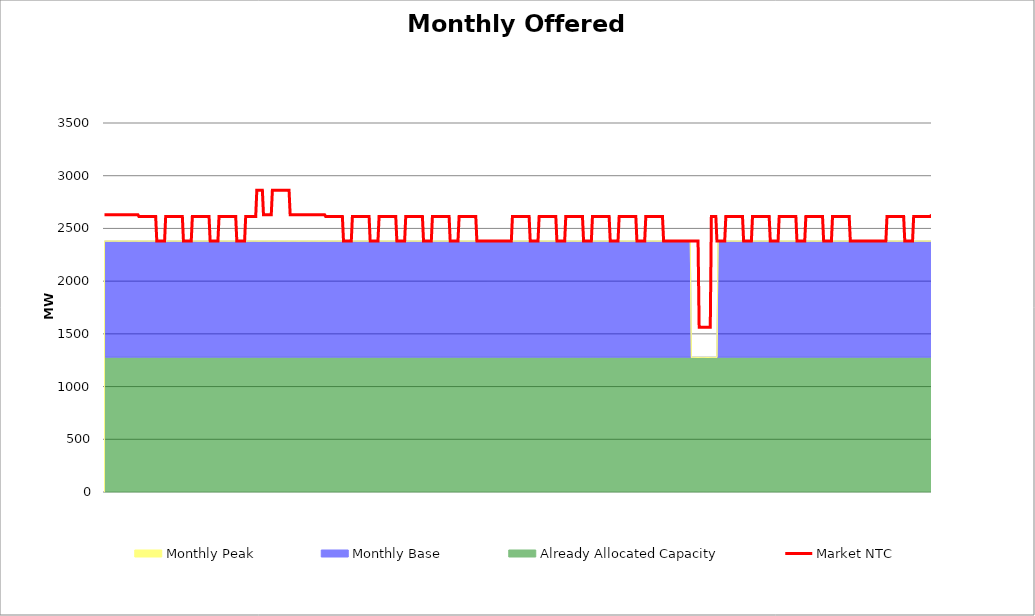
| Category | Market NTC |
|---|---|
| 0 | 2630 |
| 1 | 2630 |
| 2 | 2630 |
| 3 | 2630 |
| 4 | 2630 |
| 5 | 2630 |
| 6 | 2630 |
| 7 | 2630 |
| 8 | 2630 |
| 9 | 2630 |
| 10 | 2630 |
| 11 | 2630 |
| 12 | 2630 |
| 13 | 2630 |
| 14 | 2630 |
| 15 | 2630 |
| 16 | 2630 |
| 17 | 2630 |
| 18 | 2630 |
| 19 | 2630 |
| 20 | 2630 |
| 21 | 2630 |
| 22 | 2630 |
| 23 | 2630 |
| 24 | 2630 |
| 25 | 2630 |
| 26 | 2630 |
| 27 | 2630 |
| 28 | 2630 |
| 29 | 2630 |
| 30 | 2630 |
| 31 | 2612 |
| 32 | 2612 |
| 33 | 2612 |
| 34 | 2612 |
| 35 | 2612 |
| 36 | 2612 |
| 37 | 2612 |
| 38 | 2612 |
| 39 | 2612 |
| 40 | 2612 |
| 41 | 2612 |
| 42 | 2612 |
| 43 | 2612 |
| 44 | 2612 |
| 45 | 2612 |
| 46 | 2612 |
| 47 | 2380 |
| 48 | 2380 |
| 49 | 2380 |
| 50 | 2380 |
| 51 | 2380 |
| 52 | 2380 |
| 53 | 2380 |
| 54 | 2380 |
| 55 | 2612 |
| 56 | 2612 |
| 57 | 2612 |
| 58 | 2612 |
| 59 | 2612 |
| 60 | 2612 |
| 61 | 2612 |
| 62 | 2612 |
| 63 | 2612 |
| 64 | 2612 |
| 65 | 2612 |
| 66 | 2612 |
| 67 | 2612 |
| 68 | 2612 |
| 69 | 2612 |
| 70 | 2612 |
| 71 | 2380 |
| 72 | 2380 |
| 73 | 2380 |
| 74 | 2380 |
| 75 | 2380 |
| 76 | 2380 |
| 77 | 2380 |
| 78 | 2380 |
| 79 | 2612 |
| 80 | 2612 |
| 81 | 2612 |
| 82 | 2612 |
| 83 | 2612 |
| 84 | 2612 |
| 85 | 2612 |
| 86 | 2612 |
| 87 | 2612 |
| 88 | 2612 |
| 89 | 2612 |
| 90 | 2612 |
| 91 | 2612 |
| 92 | 2612 |
| 93 | 2612 |
| 94 | 2612 |
| 95 | 2380 |
| 96 | 2380 |
| 97 | 2380 |
| 98 | 2380 |
| 99 | 2380 |
| 100 | 2380 |
| 101 | 2380 |
| 102 | 2380 |
| 103 | 2612 |
| 104 | 2612 |
| 105 | 2612 |
| 106 | 2612 |
| 107 | 2612 |
| 108 | 2612 |
| 109 | 2612 |
| 110 | 2612 |
| 111 | 2612 |
| 112 | 2612 |
| 113 | 2612 |
| 114 | 2612 |
| 115 | 2612 |
| 116 | 2612 |
| 117 | 2612 |
| 118 | 2612 |
| 119 | 2380 |
| 120 | 2380 |
| 121 | 2380 |
| 122 | 2380 |
| 123 | 2380 |
| 124 | 2380 |
| 125 | 2380 |
| 126 | 2380 |
| 127 | 2612 |
| 128 | 2612 |
| 129 | 2612 |
| 130 | 2612 |
| 131 | 2612 |
| 132 | 2612 |
| 133 | 2612 |
| 134 | 2612 |
| 135 | 2612 |
| 136 | 2612 |
| 137 | 2862 |
| 138 | 2862 |
| 139 | 2862 |
| 140 | 2862 |
| 141 | 2862 |
| 142 | 2862 |
| 143 | 2630 |
| 144 | 2630 |
| 145 | 2630 |
| 146 | 2630 |
| 147 | 2630 |
| 148 | 2630 |
| 149 | 2630 |
| 150 | 2630 |
| 151 | 2862 |
| 152 | 2862 |
| 153 | 2862 |
| 154 | 2862 |
| 155 | 2862 |
| 156 | 2862 |
| 157 | 2862 |
| 158 | 2862 |
| 159 | 2862 |
| 160 | 2862 |
| 161 | 2862 |
| 162 | 2862 |
| 163 | 2862 |
| 164 | 2862 |
| 165 | 2862 |
| 166 | 2862 |
| 167 | 2630 |
| 168 | 2630 |
| 169 | 2630 |
| 170 | 2630 |
| 171 | 2630 |
| 172 | 2630 |
| 173 | 2630 |
| 174 | 2630 |
| 175 | 2630 |
| 176 | 2630 |
| 177 | 2630 |
| 178 | 2630 |
| 179 | 2630 |
| 180 | 2630 |
| 181 | 2630 |
| 182 | 2630 |
| 183 | 2630 |
| 184 | 2630 |
| 185 | 2630 |
| 186 | 2630 |
| 187 | 2630 |
| 188 | 2630 |
| 189 | 2630 |
| 190 | 2630 |
| 191 | 2630 |
| 192 | 2630 |
| 193 | 2630 |
| 194 | 2630 |
| 195 | 2630 |
| 196 | 2630 |
| 197 | 2630 |
| 198 | 2630 |
| 199 | 2612 |
| 200 | 2612 |
| 201 | 2612 |
| 202 | 2612 |
| 203 | 2612 |
| 204 | 2612 |
| 205 | 2612 |
| 206 | 2612 |
| 207 | 2612 |
| 208 | 2612 |
| 209 | 2612 |
| 210 | 2612 |
| 211 | 2612 |
| 212 | 2612 |
| 213 | 2612 |
| 214 | 2612 |
| 215 | 2380 |
| 216 | 2380 |
| 217 | 2380 |
| 218 | 2380 |
| 219 | 2380 |
| 220 | 2380 |
| 221 | 2380 |
| 222 | 2380 |
| 223 | 2612 |
| 224 | 2612 |
| 225 | 2612 |
| 226 | 2612 |
| 227 | 2612 |
| 228 | 2612 |
| 229 | 2612 |
| 230 | 2612 |
| 231 | 2612 |
| 232 | 2612 |
| 233 | 2612 |
| 234 | 2612 |
| 235 | 2612 |
| 236 | 2612 |
| 237 | 2612 |
| 238 | 2612 |
| 239 | 2380 |
| 240 | 2380 |
| 241 | 2380 |
| 242 | 2380 |
| 243 | 2380 |
| 244 | 2380 |
| 245 | 2380 |
| 246 | 2380 |
| 247 | 2612 |
| 248 | 2612 |
| 249 | 2612 |
| 250 | 2612 |
| 251 | 2612 |
| 252 | 2612 |
| 253 | 2612 |
| 254 | 2612 |
| 255 | 2612 |
| 256 | 2612 |
| 257 | 2612 |
| 258 | 2612 |
| 259 | 2612 |
| 260 | 2612 |
| 261 | 2612 |
| 262 | 2612 |
| 263 | 2380 |
| 264 | 2380 |
| 265 | 2380 |
| 266 | 2380 |
| 267 | 2380 |
| 268 | 2380 |
| 269 | 2380 |
| 270 | 2380 |
| 271 | 2612 |
| 272 | 2612 |
| 273 | 2612 |
| 274 | 2612 |
| 275 | 2612 |
| 276 | 2612 |
| 277 | 2612 |
| 278 | 2612 |
| 279 | 2612 |
| 280 | 2612 |
| 281 | 2612 |
| 282 | 2612 |
| 283 | 2612 |
| 284 | 2612 |
| 285 | 2612 |
| 286 | 2612 |
| 287 | 2380 |
| 288 | 2380 |
| 289 | 2380 |
| 290 | 2380 |
| 291 | 2380 |
| 292 | 2380 |
| 293 | 2380 |
| 294 | 2380 |
| 295 | 2612 |
| 296 | 2612 |
| 297 | 2612 |
| 298 | 2612 |
| 299 | 2612 |
| 300 | 2612 |
| 301 | 2612 |
| 302 | 2612 |
| 303 | 2612 |
| 304 | 2612 |
| 305 | 2612 |
| 306 | 2612 |
| 307 | 2612 |
| 308 | 2612 |
| 309 | 2612 |
| 310 | 2612 |
| 311 | 2380 |
| 312 | 2380 |
| 313 | 2380 |
| 314 | 2380 |
| 315 | 2380 |
| 316 | 2380 |
| 317 | 2380 |
| 318 | 2380 |
| 319 | 2612 |
| 320 | 2612 |
| 321 | 2612 |
| 322 | 2612 |
| 323 | 2612 |
| 324 | 2612 |
| 325 | 2612 |
| 326 | 2612 |
| 327 | 2612 |
| 328 | 2612 |
| 329 | 2612 |
| 330 | 2612 |
| 331 | 2612 |
| 332 | 2612 |
| 333 | 2612 |
| 334 | 2612 |
| 335 | 2380 |
| 336 | 2380 |
| 337 | 2380 |
| 338 | 2380 |
| 339 | 2380 |
| 340 | 2380 |
| 341 | 2380 |
| 342 | 2380 |
| 343 | 2380 |
| 344 | 2380 |
| 345 | 2380 |
| 346 | 2380 |
| 347 | 2380 |
| 348 | 2380 |
| 349 | 2380 |
| 350 | 2380 |
| 351 | 2380 |
| 352 | 2380 |
| 353 | 2380 |
| 354 | 2380 |
| 355 | 2380 |
| 356 | 2380 |
| 357 | 2380 |
| 358 | 2380 |
| 359 | 2380 |
| 360 | 2380 |
| 361 | 2380 |
| 362 | 2380 |
| 363 | 2380 |
| 364 | 2380 |
| 365 | 2380 |
| 366 | 2380 |
| 367 | 2612 |
| 368 | 2612 |
| 369 | 2612 |
| 370 | 2612 |
| 371 | 2612 |
| 372 | 2612 |
| 373 | 2612 |
| 374 | 2612 |
| 375 | 2612 |
| 376 | 2612 |
| 377 | 2612 |
| 378 | 2612 |
| 379 | 2612 |
| 380 | 2612 |
| 381 | 2612 |
| 382 | 2612 |
| 383 | 2380 |
| 384 | 2380 |
| 385 | 2380 |
| 386 | 2380 |
| 387 | 2380 |
| 388 | 2380 |
| 389 | 2380 |
| 390 | 2380 |
| 391 | 2612 |
| 392 | 2612 |
| 393 | 2612 |
| 394 | 2612 |
| 395 | 2612 |
| 396 | 2612 |
| 397 | 2612 |
| 398 | 2612 |
| 399 | 2612 |
| 400 | 2612 |
| 401 | 2612 |
| 402 | 2612 |
| 403 | 2612 |
| 404 | 2612 |
| 405 | 2612 |
| 406 | 2612 |
| 407 | 2380 |
| 408 | 2380 |
| 409 | 2380 |
| 410 | 2380 |
| 411 | 2380 |
| 412 | 2380 |
| 413 | 2380 |
| 414 | 2380 |
| 415 | 2612 |
| 416 | 2612 |
| 417 | 2612 |
| 418 | 2612 |
| 419 | 2612 |
| 420 | 2612 |
| 421 | 2612 |
| 422 | 2612 |
| 423 | 2612 |
| 424 | 2612 |
| 425 | 2612 |
| 426 | 2612 |
| 427 | 2612 |
| 428 | 2612 |
| 429 | 2612 |
| 430 | 2612 |
| 431 | 2380 |
| 432 | 2380 |
| 433 | 2380 |
| 434 | 2380 |
| 435 | 2380 |
| 436 | 2380 |
| 437 | 2380 |
| 438 | 2380 |
| 439 | 2612 |
| 440 | 2612 |
| 441 | 2612 |
| 442 | 2612 |
| 443 | 2612 |
| 444 | 2612 |
| 445 | 2612 |
| 446 | 2612 |
| 447 | 2612 |
| 448 | 2612 |
| 449 | 2612 |
| 450 | 2612 |
| 451 | 2612 |
| 452 | 2612 |
| 453 | 2612 |
| 454 | 2612 |
| 455 | 2380 |
| 456 | 2380 |
| 457 | 2380 |
| 458 | 2380 |
| 459 | 2380 |
| 460 | 2380 |
| 461 | 2380 |
| 462 | 2380 |
| 463 | 2612 |
| 464 | 2612 |
| 465 | 2612 |
| 466 | 2612 |
| 467 | 2612 |
| 468 | 2612 |
| 469 | 2612 |
| 470 | 2612 |
| 471 | 2612 |
| 472 | 2612 |
| 473 | 2612 |
| 474 | 2612 |
| 475 | 2612 |
| 476 | 2612 |
| 477 | 2612 |
| 478 | 2612 |
| 479 | 2380 |
| 480 | 2380 |
| 481 | 2380 |
| 482 | 2380 |
| 483 | 2380 |
| 484 | 2380 |
| 485 | 2380 |
| 486 | 2380 |
| 487 | 2612 |
| 488 | 2612 |
| 489 | 2612 |
| 490 | 2612 |
| 491 | 2612 |
| 492 | 2612 |
| 493 | 2612 |
| 494 | 2612 |
| 495 | 2612 |
| 496 | 2612 |
| 497 | 2612 |
| 498 | 2612 |
| 499 | 2612 |
| 500 | 2612 |
| 501 | 2612 |
| 502 | 2612 |
| 503 | 2380 |
| 504 | 2380 |
| 505 | 2380 |
| 506 | 2380 |
| 507 | 2380 |
| 508 | 2380 |
| 509 | 2380 |
| 510 | 2380 |
| 511 | 2380 |
| 512 | 2380 |
| 513 | 2380 |
| 514 | 2380 |
| 515 | 2380 |
| 516 | 2380 |
| 517 | 2380 |
| 518 | 2380 |
| 519 | 2380 |
| 520 | 2380 |
| 521 | 2380 |
| 522 | 2380 |
| 523 | 2380 |
| 524 | 2380 |
| 525 | 2380 |
| 526 | 2380 |
| 527 | 2380 |
| 528 | 2380 |
| 529 | 2380 |
| 530 | 2380 |
| 531 | 2380 |
| 532 | 2380 |
| 533 | 2380 |
| 534 | 2380 |
| 535 | 1562 |
| 536 | 1562 |
| 537 | 1562 |
| 538 | 1562 |
| 539 | 1562 |
| 540 | 1562 |
| 541 | 1562 |
| 542 | 1562 |
| 543 | 1562 |
| 544 | 1562 |
| 545 | 1562 |
| 546 | 2612 |
| 547 | 2612 |
| 548 | 2612 |
| 549 | 2612 |
| 550 | 2612 |
| 551 | 2380 |
| 552 | 2380 |
| 553 | 2380 |
| 554 | 2380 |
| 555 | 2380 |
| 556 | 2380 |
| 557 | 2380 |
| 558 | 2380 |
| 559 | 2612 |
| 560 | 2612 |
| 561 | 2612 |
| 562 | 2612 |
| 563 | 2612 |
| 564 | 2612 |
| 565 | 2612 |
| 566 | 2612 |
| 567 | 2612 |
| 568 | 2612 |
| 569 | 2612 |
| 570 | 2612 |
| 571 | 2612 |
| 572 | 2612 |
| 573 | 2612 |
| 574 | 2612 |
| 575 | 2380 |
| 576 | 2380 |
| 577 | 2380 |
| 578 | 2380 |
| 579 | 2380 |
| 580 | 2380 |
| 581 | 2380 |
| 582 | 2380 |
| 583 | 2612 |
| 584 | 2612 |
| 585 | 2612 |
| 586 | 2612 |
| 587 | 2612 |
| 588 | 2612 |
| 589 | 2612 |
| 590 | 2612 |
| 591 | 2612 |
| 592 | 2612 |
| 593 | 2612 |
| 594 | 2612 |
| 595 | 2612 |
| 596 | 2612 |
| 597 | 2612 |
| 598 | 2612 |
| 599 | 2380 |
| 600 | 2380 |
| 601 | 2380 |
| 602 | 2380 |
| 603 | 2380 |
| 604 | 2380 |
| 605 | 2380 |
| 606 | 2380 |
| 607 | 2612 |
| 608 | 2612 |
| 609 | 2612 |
| 610 | 2612 |
| 611 | 2612 |
| 612 | 2612 |
| 613 | 2612 |
| 614 | 2612 |
| 615 | 2612 |
| 616 | 2612 |
| 617 | 2612 |
| 618 | 2612 |
| 619 | 2612 |
| 620 | 2612 |
| 621 | 2612 |
| 622 | 2612 |
| 623 | 2380 |
| 624 | 2380 |
| 625 | 2380 |
| 626 | 2380 |
| 627 | 2380 |
| 628 | 2380 |
| 629 | 2380 |
| 630 | 2380 |
| 631 | 2612 |
| 632 | 2612 |
| 633 | 2612 |
| 634 | 2612 |
| 635 | 2612 |
| 636 | 2612 |
| 637 | 2612 |
| 638 | 2612 |
| 639 | 2612 |
| 640 | 2612 |
| 641 | 2612 |
| 642 | 2612 |
| 643 | 2612 |
| 644 | 2612 |
| 645 | 2612 |
| 646 | 2612 |
| 647 | 2380 |
| 648 | 2380 |
| 649 | 2380 |
| 650 | 2380 |
| 651 | 2380 |
| 652 | 2380 |
| 653 | 2380 |
| 654 | 2380 |
| 655 | 2612 |
| 656 | 2612 |
| 657 | 2612 |
| 658 | 2612 |
| 659 | 2612 |
| 660 | 2612 |
| 661 | 2612 |
| 662 | 2612 |
| 663 | 2612 |
| 664 | 2612 |
| 665 | 2612 |
| 666 | 2612 |
| 667 | 2612 |
| 668 | 2612 |
| 669 | 2612 |
| 670 | 2612 |
| 671 | 2380 |
| 672 | 2380 |
| 673 | 2380 |
| 674 | 2380 |
| 675 | 2380 |
| 676 | 2380 |
| 677 | 2380 |
| 678 | 2380 |
| 679 | 2380 |
| 680 | 2380 |
| 681 | 2380 |
| 682 | 2380 |
| 683 | 2380 |
| 684 | 2380 |
| 685 | 2380 |
| 686 | 2380 |
| 687 | 2380 |
| 688 | 2380 |
| 689 | 2380 |
| 690 | 2380 |
| 691 | 2380 |
| 692 | 2380 |
| 693 | 2380 |
| 694 | 2380 |
| 695 | 2380 |
| 696 | 2380 |
| 697 | 2380 |
| 698 | 2380 |
| 699 | 2380 |
| 700 | 2380 |
| 701 | 2380 |
| 702 | 2380 |
| 703 | 2380 |
| 704 | 2612 |
| 705 | 2612 |
| 706 | 2612 |
| 707 | 2612 |
| 708 | 2612 |
| 709 | 2612 |
| 710 | 2612 |
| 711 | 2612 |
| 712 | 2612 |
| 713 | 2612 |
| 714 | 2612 |
| 715 | 2612 |
| 716 | 2612 |
| 717 | 2612 |
| 718 | 2612 |
| 719 | 2612 |
| 720 | 2380 |
| 721 | 2380 |
| 722 | 2380 |
| 723 | 2380 |
| 724 | 2380 |
| 725 | 2380 |
| 726 | 2380 |
| 727 | 2380 |
| 728 | 2612 |
| 729 | 2612 |
| 730 | 2612 |
| 731 | 2612 |
| 732 | 2612 |
| 733 | 2612 |
| 734 | 2612 |
| 735 | 2612 |
| 736 | 2612 |
| 737 | 2612 |
| 738 | 2612 |
| 739 | 2612 |
| 740 | 2612 |
| 741 | 2612 |
| 742 | 2612 |
| 743 | 2612 |
| 744 | 2630 |